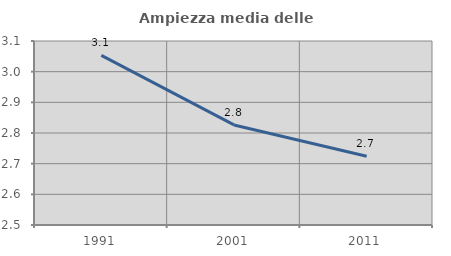
| Category | Ampiezza media delle famiglie |
|---|---|
| 1991.0 | 3.053 |
| 2001.0 | 2.826 |
| 2011.0 | 2.724 |